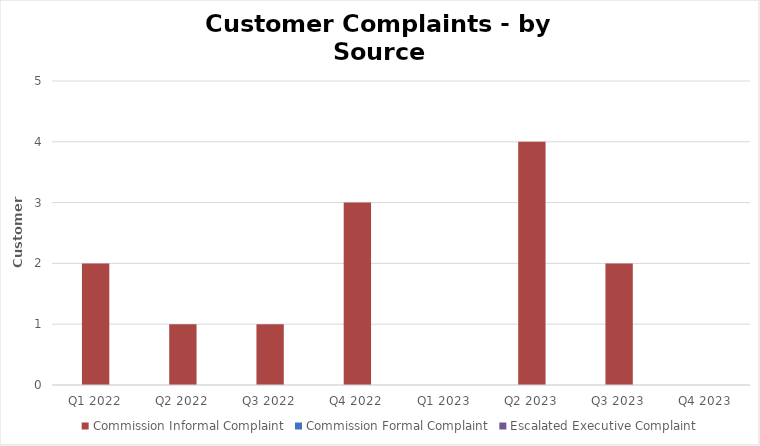
| Category | Commission Informal Complaint | Commission Formal Complaint | Escalated Executive Complaint |
|---|---|---|---|
| Q1 2022 | 2 | 0 | 0 |
| Q2 2022 | 1 | 0 | 0 |
| Q3 2022 | 1 | 0 | 0 |
| Q4 2022 | 3 | 0 | 0 |
| Q1 2023 | 0 | 0 | 0 |
| Q2 2023 | 4 | 0 | 0 |
| Q3 2023 | 2 | 0 | 0 |
| Q4 2023 | 0 | 0 | 0 |